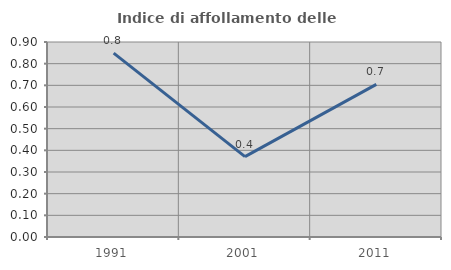
| Category | Indice di affollamento delle abitazioni  |
|---|---|
| 1991.0 | 0.849 |
| 2001.0 | 0.371 |
| 2011.0 | 0.704 |